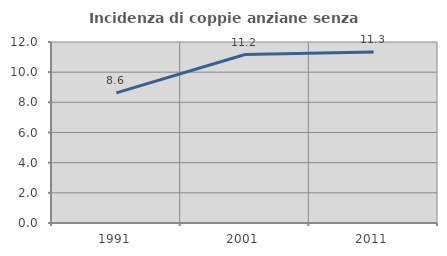
| Category | Incidenza di coppie anziane senza figli  |
|---|---|
| 1991.0 | 8.625 |
| 2001.0 | 11.17 |
| 2011.0 | 11.33 |